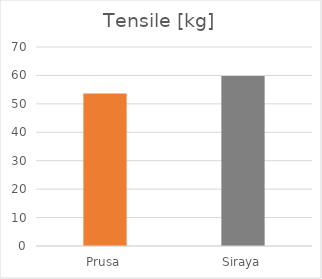
| Category | Tensile [kg] |
|---|---|
| Prusa | 53.6 |
| Siraya | 59.8 |